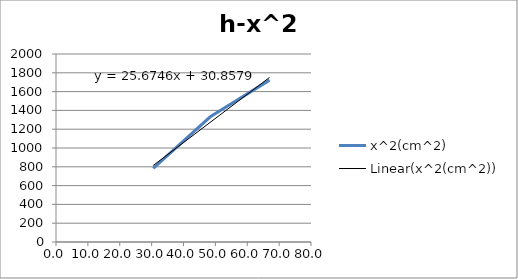
| Category | x^2(cm^2) |
|---|---|
| 30.5 | 784 |
| 48.4 | 1332.25 |
| 67.0 | 1722.25 |